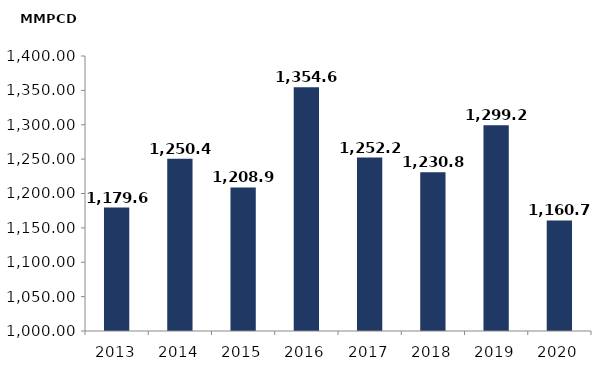
| Category | Series 0 |
|---|---|
| 2013.0 | 1179.6 |
| 2014.0 | 1250.4 |
| 2015.0 | 1208.9 |
| 2016.0 | 1354.6 |
| 2017.0 | 1252.2 |
| 2018.0 | 1230.8 |
| 2019.0 | 1299.274 |
| 2020.0 | 1160.73 |